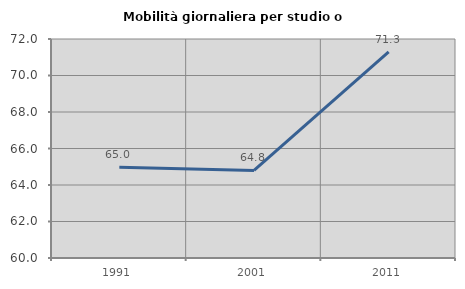
| Category | Mobilità giornaliera per studio o lavoro |
|---|---|
| 1991.0 | 64.979 |
| 2001.0 | 64.797 |
| 2011.0 | 71.292 |